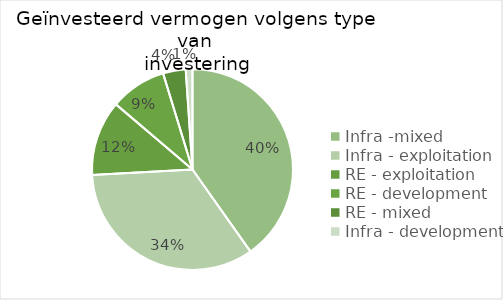
| Category | Series 0 |
|---|---|
| Infra -mixed  | 64.726 |
| Infra - exploitation | 54.607 |
| RE - exploitation | 19.464 |
| RE - development | 14.573 |
| RE - mixed | 5.863 |
| Infra - development | 1.743 |